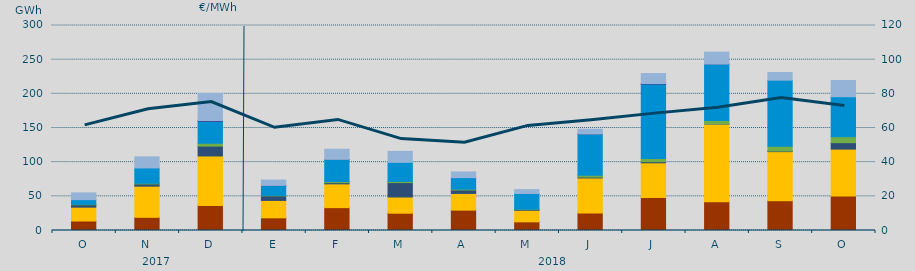
| Category | Carbón | Ciclo Combinado | Cogeneración | Consumo Bombeo | Eólica | Hidráulica | Nuclear | Turbinación bombeo |
|---|---|---|---|---|---|---|---|---|
| O | 13899.2 | 20227.3 | 0 | 3473.9 | 731.2 | 6859.3 | 0 | 9809.3 |
| N | 19298.3 | 45604 | 0 | 3226 | 983.4 | 22432 | 0 | 16186.5 |
| D | 36464.5 | 72616.8 | 0 | 14393.3 | 4195.1 | 32118.7 | 1236 | 39485.4 |
| E | 18538.8 | 25466.6 | 0 | 6696 | 686 | 14339.3 | 277 | 7767.7 |
| F | 33434.8 | 34817.7 | 0 | 1704 | 1654.6 | 32219.8 | 258 | 14790.9 |
| M | 25308.3 | 23702.3 | 0 | 21100.1 | 1712.3 | 27908.3 | 0 | 16090.2 |
| A | 29845.7 | 24356.1 | 74 | 4947.9 | 1233.1 | 16888.6 | 0 | 8367.7 |
| M | 12672 | 16812.4 | 0 | 952.5 | 730.5 | 23001.2 | 0 | 5631.5 |
| J | 25536.3 | 51382.8 | 0 | 1275.4 | 2784.2 | 59979.3 | 310 | 6998.5 |
| J | 48129.9 | 50935.7 | 0 | 1629.2 | 4531.2 | 109037.6 | 831.6 | 14563.8 |
| A | 41909.8 | 113971.2 | 10 | 188 | 5055.3 | 82431.3 | 20 | 17427.3 |
| S | 43665.8 | 71749.1 | 0 | 763.8 | 7207.5 | 96608.1 | 0 | 11156.8 |
| O | 50474 | 68624.5 | 0 | 9392.7 | 8694 | 58581.5 | 0 | 23733.8 |